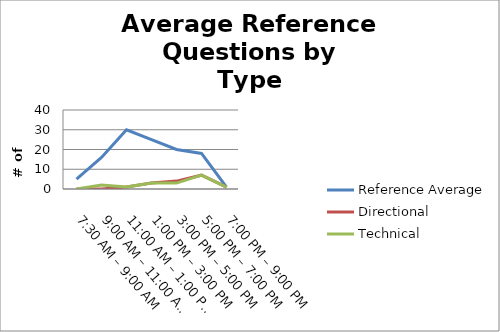
| Category | Reference Average | Directional | Technical |
|---|---|---|---|
| 7:30 AM – 9:00 AM | 5 | 0 | 0 |
| 9:00 AM – 11:00 AM | 16 | 0 | 2 |
| 11:00 AM – 1:00 PM | 30 | 1 | 1 |
| 1:00 PM – 3:00 PM | 25 | 3 | 3 |
| 3:00 PM – 5:00 PM | 20 | 4 | 3 |
| 5:00 PM – 7:00 PM | 18 | 7 | 7 |
| 7:00 PM – 9:00 PM | 1 | 1 | 1 |